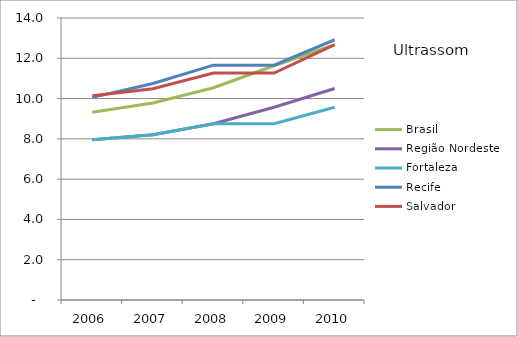
| Category | Brasil | Região Nordeste | Fortaleza | Recife | Salvador |
|---|---|---|---|---|---|
| 2006.0 | 9.32 | 7.95 | 7.95 | 10.06 | 10.14 |
| 2007.0 | 9.78 | 8.2 | 8.2 | 10.75 | 10.49 |
| 2008.0 | 10.54 | 8.75 | 8.75 | 11.66 | 11.27 |
| 2009.0 | 11.63 | 9.57 | 8.75 | 11.66 | 11.27 |
| 2010.0 | 12.67 | 10.5 | 9.57 | 12.92 | 12.68 |